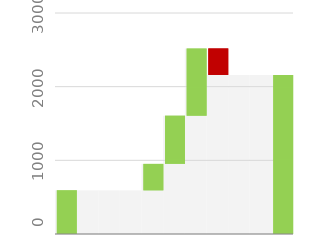
| Category | Series 2 |
|---|---|
| 0 | 592.5 |
| 1 | 592.5 |
| 2 | 592.5 |
| 3 | 592.5 |
| 4 | 951.75 |
| 5 | 1605.92 |
| 6 | 2519.085 |
| 7 | 2159.085 |
| 8 | 2159.085 |
| 9 | 2159.085 |
| 10 | 2159.085 |